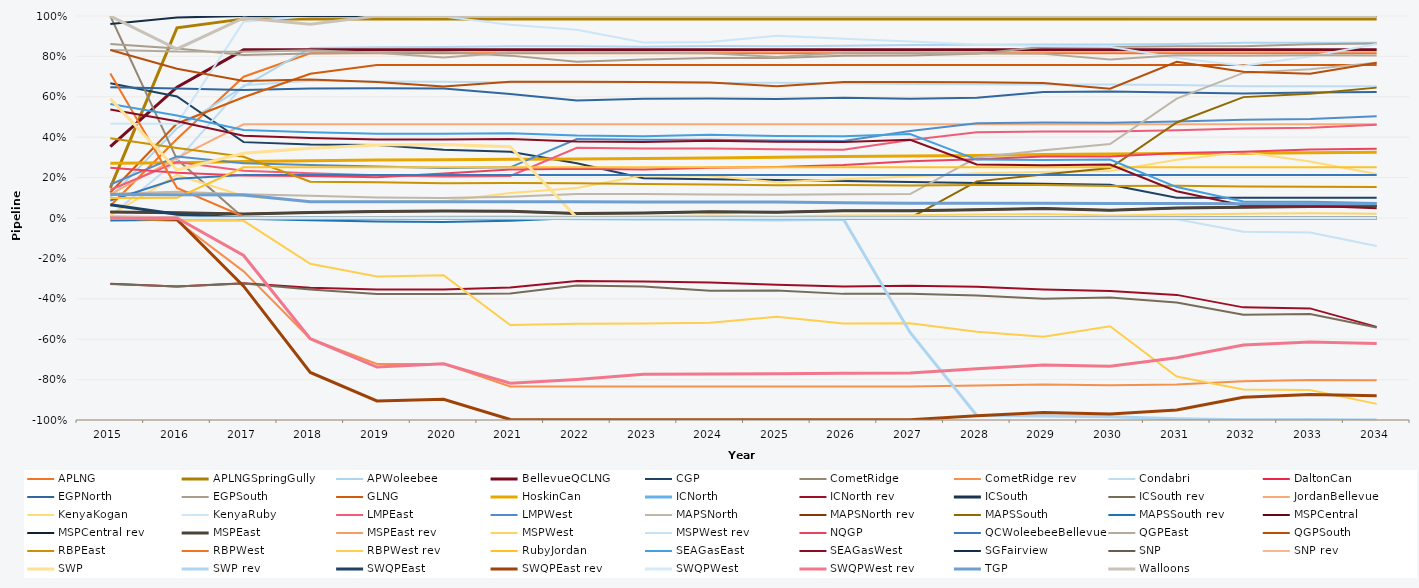
| Category | APLNG | APLNGSpringGully | APWoleebee | BellevueQCLNG | CGP | CometRidge | CometRidge rev | Condabri | DaltonCan | EGPNorth | EGPSouth | GLNG | HoskinCan | ICNorth | ICNorth rev | ICSouth | ICSouth rev | JordanBellevue | KenyaKogan | KenyaRuby | LMPEast | LMPWest | MAPSNorth | MAPSNorth rev | MAPSSouth | MAPSSouth rev | MSPCentral | MSPCentral rev | MSPEast | MSPEast rev | MSPWest | MSPWest rev | NQGP | QCWoleebeeBellevue | QGPEast | QGPSouth | RBPEast | RBPWest | RBPWest rev | RubyJordan | SEAGasEast | SEAGasWest | SGFairview | SNP | SNP rev | SWP | SWP rev | SWQPEast | SWQPEast rev | SWQPWest | SWQPWest rev | TGP | Walloons |
|---|---|---|---|---|---|---|---|---|---|---|---|---|---|---|---|---|---|---|---|---|---|---|---|---|---|---|---|---|---|---|---|---|---|---|---|---|---|---|---|---|---|---|---|---|---|---|---|---|---|---|---|---|---|
| 2015.0 | 0.061 | 0.149 | 0.102 | 0.353 | 0.667 | 1 | 0 | 0.01 | 0 | 0.647 | 0.861 | 0.127 | 0.272 | 0 | -0.325 | 0 | -0.326 | 0.117 | 0.013 | 0.467 | 0.14 | 0.166 | 0.12 | 0 | 0.005 | -0.013 | 0.029 | 0 | 0.029 | 0 | 0.011 | 0 | 0.249 | 0.087 | 0.832 | 0.832 | 0.395 | 0.715 | 0 | 0.099 | 0.564 | 0.537 | 0.961 | 0 | 0 | 0.59 | 0 | 0.065 | 0 | 0 | 0 | 0.117 | 0.999 |
| 2016.0 | 0.391 | 0.941 | 0.444 | 0.648 | 0.602 | 0.29 | -0.015 | 0.284 | 0 | 0.642 | 0.839 | 0.468 | 0.273 | 0 | -0.339 | 0 | -0.339 | 0.297 | 0.213 | 0.467 | 0.277 | 0.305 | 0.129 | 0 | 0.004 | -0.008 | 0.026 | 0 | 0.026 | 0 | 0.002 | 0 | 0.224 | 0.195 | 0.824 | 0.739 | 0.346 | 0.149 | -0.014 | 0.1 | 0.507 | 0.479 | 0.993 | 0 | 0 | 0.237 | 0 | 0.018 | -0.007 | 0 | 0 | 0.115 | 0.837 |
| 2017.0 | 0.7 | 0.986 | 0.65 | 0.833 | 0.376 | 0 | -0.264 | 0.657 | 0 | 0.634 | 0.807 | 0.597 | 0.28 | 0 | -0.323 | 0 | -0.324 | 0.464 | 0.109 | 0.971 | 0.234 | 0.271 | 0.118 | 0 | 0.001 | -0.004 | 0.02 | 0 | 0.02 | 0 | 0.001 | 0 | 0.211 | 0.213 | 0.823 | 0.678 | 0.303 | 0.008 | -0.014 | 0.251 | 0.436 | 0.407 | 1 | 0 | 0 | 0.32 | 0 | 0 | -0.337 | 0 | -0.185 | 0.114 | 0.99 |
| 2018.0 | 0.816 | 0.986 | 0.842 | 0.833 | 0.363 | 0 | -0.598 | 0.679 | 0 | 0.641 | 0.815 | 0.714 | 0.284 | 0 | -0.345 | 0 | -0.354 | 0.464 | 0.08 | 1 | 0.221 | 0.263 | 0.11 | 0 | 0 | -0.011 | 0.027 | 0 | 0.027 | 0 | 0.003 | 0 | 0.208 | 0.213 | 0.83 | 0.685 | 0.18 | 0 | -0.227 | 0.251 | 0.425 | 0.396 | 1 | 0 | 0 | 0.345 | 0 | 0 | -0.764 | 0 | -0.598 | 0.081 | 0.959 |
| 2019.0 | 0.816 | 0.986 | 0.845 | 0.833 | 0.361 | 0 | -0.722 | 0.676 | 0 | 0.642 | 0.819 | 0.758 | 0.287 | 0 | -0.353 | 0 | -0.376 | 0.464 | 0.08 | 1 | 0.212 | 0.254 | 0.102 | 0 | 0 | -0.017 | 0.032 | 0 | 0.032 | 0 | 0.005 | 0 | 0.202 | 0.213 | 0.818 | 0.673 | 0.177 | 0 | -0.289 | 0.251 | 0.417 | 0.388 | 1 | 0 | 0 | 0.361 | 0 | 0 | -0.906 | 0 | -0.738 | 0.081 | 1 |
| 2020.0 | 0.816 | 0.986 | 0.846 | 0.833 | 0.338 | 0 | -0.722 | 0.674 | 0 | 0.641 | 0.821 | 0.758 | 0.288 | 0 | -0.354 | 0 | -0.376 | 0.464 | 0.083 | 0.997 | 0.205 | 0.248 | 0.099 | 0 | 0 | -0.02 | 0.034 | 0 | 0.034 | 0 | 0.007 | 0 | 0.22 | 0.213 | 0.795 | 0.65 | 0.172 | 0 | -0.283 | 0.251 | 0.417 | 0.388 | 1 | 0 | 0 | 0.364 | 0 | 0 | -0.897 | 0 | -0.721 | 0.081 | 1 |
| 2021.0 | 0.816 | 0.986 | 0.85 | 0.833 | 0.327 | 0 | -0.834 | 0.671 | 0 | 0.614 | 0.804 | 0.758 | 0.291 | 0 | -0.344 | 0 | -0.374 | 0.464 | 0.124 | 0.956 | 0.208 | 0.251 | 0.106 | 0 | 0 | -0.013 | 0.034 | 0 | 0.034 | 0 | 0.009 | 0 | 0.24 | 0.213 | 0.819 | 0.674 | 0.173 | 0 | -0.53 | 0.251 | 0.42 | 0.391 | 1 | 0 | 0 | 0.352 | 0 | 0 | -0.998 | 0 | -0.818 | 0.081 | 1 |
| 2022.0 | 0.816 | 0.986 | 0.85 | 0.833 | 0.271 | 0 | -0.834 | 0.671 | 0 | 0.582 | 0.774 | 0.758 | 0.292 | 0 | -0.312 | 0 | -0.335 | 0.464 | 0.148 | 0.932 | 0.347 | 0.39 | 0.119 | 0 | 0 | 0 | 0.022 | 0 | 0.022 | 0 | 0.006 | 0 | 0.244 | 0.213 | 0.819 | 0.674 | 0.172 | 0 | -0.524 | 0.251 | 0.408 | 0.379 | 1 | 0 | 0 | 0.001 | -0.003 | 0 | -0.999 | 0 | -0.8 | 0.08 | 1 |
| 2023.0 | 0.816 | 0.986 | 0.848 | 0.833 | 0.197 | 0 | -0.834 | 0.673 | 0 | 0.59 | 0.784 | 0.758 | 0.295 | 0 | -0.314 | 0 | -0.339 | 0.464 | 0.211 | 0.869 | 0.344 | 0.388 | 0.118 | 0 | 0 | 0 | 0.025 | 0 | 0.025 | 0 | 0.008 | 0 | 0.24 | 0.213 | 0.818 | 0.674 | 0.168 | 0 | -0.522 | 0.251 | 0.404 | 0.376 | 1 | 0 | 0 | 0.001 | -0.007 | 0 | -0.999 | 0 | -0.774 | 0.08 | 1 |
| 2024.0 | 0.816 | 0.986 | 0.852 | 0.833 | 0.192 | 0 | -0.834 | 0.669 | 0 | 0.591 | 0.792 | 0.758 | 0.297 | 0 | -0.319 | 0 | -0.36 | 0.464 | 0.209 | 0.871 | 0.344 | 0.387 | 0.116 | 0 | 0 | -0.002 | 0.031 | 0 | 0.031 | 0 | 0.013 | 0 | 0.248 | 0.213 | 0.816 | 0.671 | 0.165 | 0 | -0.519 | 0.251 | 0.412 | 0.383 | 1 | 0 | 0 | 0 | -0.006 | 0 | -0.999 | 0 | -0.772 | 0.079 | 1 |
| 2025.0 | 0.816 | 0.986 | 0.851 | 0.833 | 0.188 | 0 | -0.834 | 0.67 | 0 | 0.589 | 0.792 | 0.758 | 0.301 | 0 | -0.331 | 0 | -0.359 | 0.464 | 0.177 | 0.903 | 0.34 | 0.384 | 0.115 | 0 | 0 | -0.003 | 0.029 | 0 | 0.029 | 0 | 0.008 | 0 | 0.253 | 0.213 | 0.796 | 0.652 | 0.162 | 0 | -0.488 | 0.251 | 0.406 | 0.377 | 1 | 0 | 0 | 0 | -0.01 | 0 | -0.999 | 0 | -0.771 | 0.079 | 1 |
| 2026.0 | 0.816 | 0.986 | 0.853 | 0.833 | 0.183 | 0 | -0.834 | 0.668 | 0 | 0.595 | 0.803 | 0.758 | 0.304 | 0 | -0.34 | 0 | -0.376 | 0.464 | 0.192 | 0.888 | 0.338 | 0.382 | 0.118 | 0 | 0 | 0 | 0.036 | 0 | 0.036 | 0 | 0.013 | 0 | 0.262 | 0.213 | 0.818 | 0.673 | 0.163 | 0 | -0.522 | 0.251 | 0.405 | 0.376 | 1 | 0 | 0 | 0.001 | -0.006 | 0 | -0.999 | 0 | -0.769 | 0.076 | 1 |
| 2027.0 | 0.816 | 0.986 | 0.856 | 0.833 | 0.179 | 0 | -0.834 | 0.664 | 0 | 0.59 | 0.805 | 0.758 | 0.307 | 0 | -0.336 | 0 | -0.375 | 0.464 | 0.206 | 0.874 | 0.387 | 0.43 | 0.118 | 0 | 0 | 0 | 0.036 | 0 | 0.036 | 0 | 0.013 | 0 | 0.281 | 0.213 | 0.818 | 0.674 | 0.161 | 0 | -0.521 | 0.251 | 0.416 | 0.387 | 1 | 0 | 0 | 0.001 | -0.567 | 0 | -0.998 | 0 | -0.767 | 0.073 | 1 |
| 2028.0 | 0.816 | 0.986 | 0.858 | 0.833 | 0.174 | 0 | -0.83 | 0.662 | 0 | 0.595 | 0.814 | 0.758 | 0.309 | 0 | -0.34 | 0 | -0.384 | 0.464 | 0.222 | 0.858 | 0.425 | 0.469 | 0.299 | 0 | 0.181 | 0 | 0.041 | 0 | 0.041 | 0 | 0.017 | 0 | 0.291 | 0.213 | 0.816 | 0.671 | 0.163 | 0 | -0.563 | 0.251 | 0.289 | 0.265 | 1 | 0 | 0 | 0 | -0.977 | 0 | -0.979 | 0 | -0.746 | 0.073 | 1 |
| 2029.0 | 0.816 | 0.986 | 0.859 | 0.833 | 0.17 | 0 | -0.825 | 0.661 | 0 | 0.624 | 0.848 | 0.758 | 0.314 | 0 | -0.354 | 0 | -0.4 | 0.464 | 0.228 | 0.852 | 0.429 | 0.472 | 0.335 | 0 | 0.216 | 0 | 0.046 | 0 | 0.046 | 0 | 0.02 | -0.001 | 0.305 | 0.213 | 0.813 | 0.668 | 0.163 | 0 | -0.588 | 0.251 | 0.287 | 0.261 | 1 | 0 | 0 | 0 | -0.98 | 0 | -0.963 | 0 | -0.728 | 0.073 | 1 |
| 2030.0 | 0.816 | 0.986 | 0.859 | 0.833 | 0.165 | 0 | -0.828 | 0.661 | 0 | 0.627 | 0.847 | 0.758 | 0.317 | 0 | -0.362 | 0 | -0.393 | 0.464 | 0.233 | 0.847 | 0.428 | 0.472 | 0.366 | 0 | 0.247 | 0 | 0.039 | 0 | 0.039 | 0 | 0.012 | -0.006 | 0.304 | 0.213 | 0.785 | 0.64 | 0.158 | 0 | -0.536 | 0.251 | 0.29 | 0.264 | 1 | 0 | 0 | 0 | -0.983 | 0 | -0.971 | 0 | -0.734 | 0.072 | 0.999 |
| 2031.0 | 0.816 | 0.986 | 0.861 | 0.833 | 0.101 | 0 | -0.824 | 0.659 | 0 | 0.622 | 0.85 | 0.758 | 0.32 | 0 | -0.381 | 0 | -0.419 | 0.464 | 0.288 | 0.792 | 0.434 | 0.478 | 0.591 | 0 | 0.473 | 0 | 0.049 | 0 | 0.049 | 0 | 0.017 | -0.006 | 0.322 | 0.213 | 0.806 | 0.773 | 0.159 | 0 | -0.784 | 0.251 | 0.153 | 0.133 | 1 | 0 | 0 | 0 | -0.994 | 0 | -0.951 | 0 | -0.692 | 0.071 | 0.999 |
| 2032.0 | 0.816 | 0.986 | 0.867 | 0.833 | 0.1 | 0 | -0.808 | 0.653 | 0 | 0.617 | 0.85 | 0.758 | 0.321 | 0.001 | -0.442 | 0 | -0.479 | 0.464 | 0.327 | 0.753 | 0.443 | 0.487 | 0.718 | 0 | 0.598 | 0 | 0.053 | 0 | 0.053 | 0 | 0.021 | -0.068 | 0.328 | 0.213 | 0.804 | 0.724 | 0.156 | 0 | -0.849 | 0.251 | 0.081 | 0.061 | 1 | 0 | 0 | 0 | -0.998 | 0 | -0.887 | 0 | -0.628 | 0.071 | 0.999 |
| 2033.0 | 0.816 | 0.986 | 0.867 | 0.833 | 0.1 | 0 | -0.802 | 0.653 | 0 | 0.622 | 0.86 | 0.758 | 0.323 | 0 | -0.447 | 0 | -0.475 | 0.464 | 0.28 | 0.8 | 0.447 | 0.491 | 0.736 | 0 | 0.615 | 0 | 0.057 | 0 | 0.057 | 0 | 0.024 | -0.071 | 0.339 | 0.213 | 0.805 | 0.715 | 0.155 | 0 | -0.851 | 0.251 | 0.081 | 0.061 | 1 | 0 | 0 | 0 | -0.998 | 0 | -0.873 | 0 | -0.614 | 0.07 | 0.998 |
| 2034.0 | 0.816 | 0.986 | 0.868 | 0.833 | 0.1 | 0 | -0.803 | 0.652 | 0 | 0.624 | 0.864 | 0.758 | 0.325 | 0 | -0.539 | 0 | -0.542 | 0.464 | 0.218 | 0.862 | 0.461 | 0.504 | 0.768 | 0 | 0.645 | 0 | 0.06 | 0 | 0.06 | 0 | 0.021 | -0.139 | 0.343 | 0.213 | 0.805 | 0.768 | 0.153 | 0 | -0.92 | 0.251 | 0.075 | 0.049 | 1 | 0 | 0 | 0 | -1 | 0 | -0.88 | 0 | -0.621 | 0.07 | 0.998 |